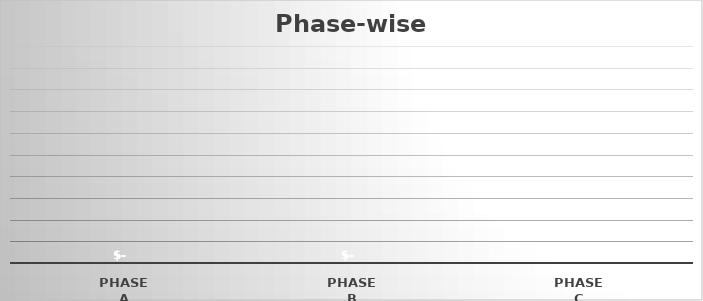
| Category | A |
|---|---|
| Phase A | 0 |
| Phase B | 0 |
| Phase C | 0 |